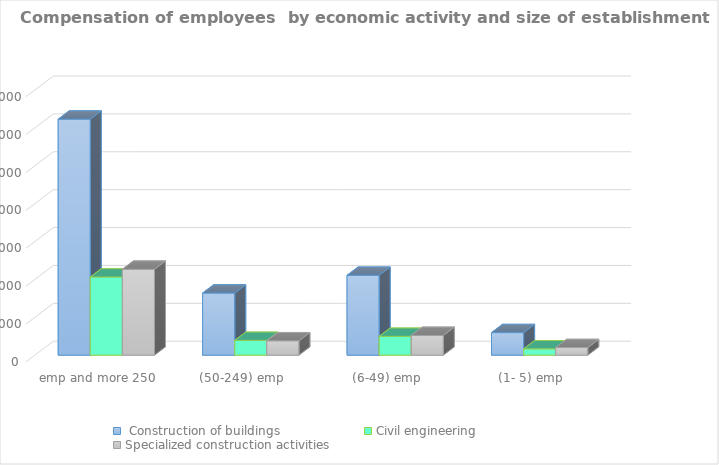
| Category |  Construction of buildings | Civil engineering | Specialized construction activities |
|---|---|---|---|
|  (1- 5) emp  | 1190738.511 | 332870.251 | 401812.08 |
|  (6-49) emp  | 4215725.175 | 993370.753 | 1042887.742 |
|  (50-249) emp  | 3278705.242 | 779661.702 | 758602.296 |
|  emp and more 250  | 12457818.94 | 4124962.611 | 4536042.606 |